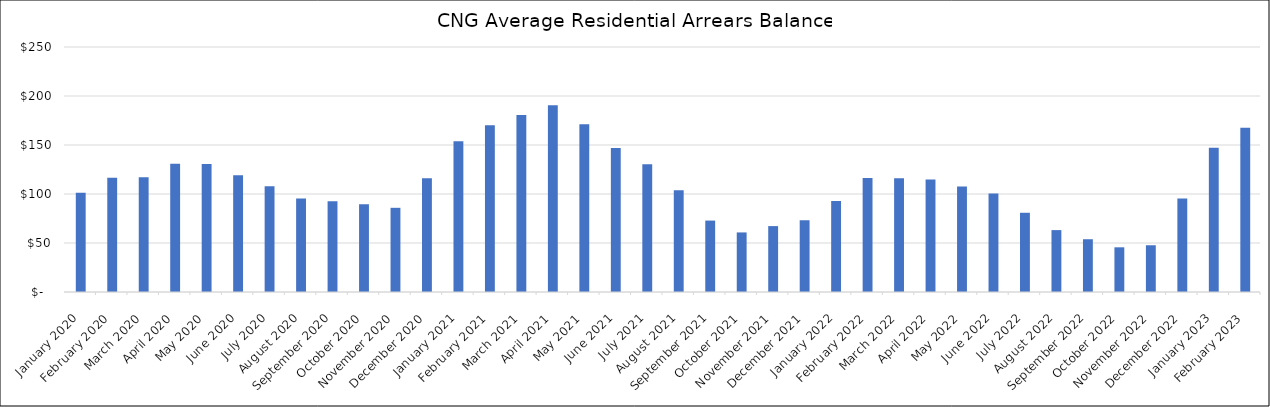
| Category | Average Arrears Balance |
|---|---|
| 2020-01-01 | 101.271 |
| 2020-02-01 | 116.561 |
| 2020-03-01 | 117.204 |
| 2020-04-01 | 130.902 |
| 2020-05-01 | 130.518 |
| 2020-06-01 | 119.007 |
| 2020-07-01 | 107.955 |
| 2020-08-01 | 95.349 |
| 2020-09-01 | 92.692 |
| 2020-10-01 | 89.527 |
| 2020-11-01 | 85.914 |
| 2020-12-01 | 116.018 |
| 2021-01-01 | 153.839 |
| 2021-02-01 | 170.185 |
| 2021-03-01 | 180.492 |
| 2021-04-01 | 190.534 |
| 2021-05-01 | 171.08 |
| 2021-06-01 | 146.819 |
| 2021-07-01 | 130.441 |
| 2021-08-01 | 103.77 |
| 2021-09-01 | 72.88 |
| 2021-10-01 | 60.788 |
| 2021-11-01 | 67.247 |
| 2021-12-01 | 73.214 |
| 2022-01-01 | 92.9 |
| 2022-02-01 | 116.444 |
| 2022-03-01 | 115.945 |
| 2022-04-01 | 114.916 |
| 2022-05-01 | 107.64 |
| 2022-06-01 | 100.396 |
| 2022-07-01 | 80.848 |
| 2022-08-01 | 63.156 |
| 2022-09-01 | 53.843 |
| 2022-10-01 | 45.601 |
| 2022-11-01 | 47.699 |
| 2022-12-01 | 95.387 |
| 2023-01-01 | 147.185 |
| 2023-02-01 | 167.663 |